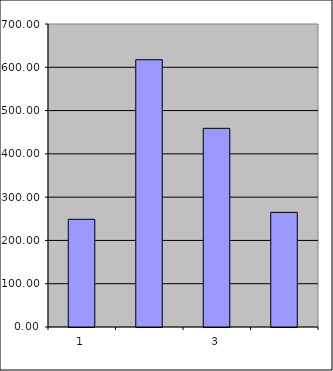
| Category | Series 0 |
|---|---|
| 0 | 248.75 |
| 1 | 617.437 |
| 2 | 458.968 |
| 3 | 264.819 |